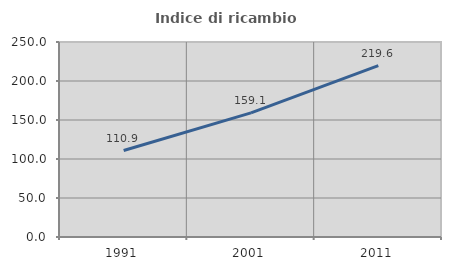
| Category | Indice di ricambio occupazionale  |
|---|---|
| 1991.0 | 110.875 |
| 2001.0 | 159.13 |
| 2011.0 | 219.602 |